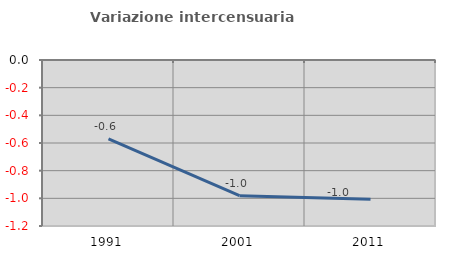
| Category | Variazione intercensuaria annua |
|---|---|
| 1991.0 | -0.57 |
| 2001.0 | -0.981 |
| 2011.0 | -1.006 |